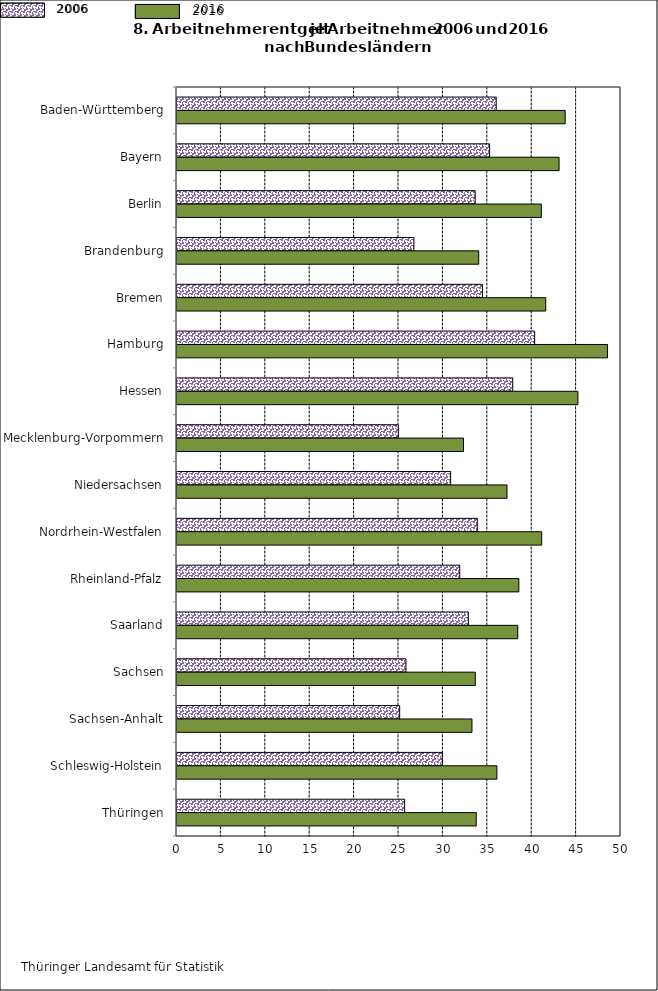
| Category | Series 3 | Series 4 |
|---|---|---|
| Baden-Württemberg | 35.951 | 43.715 |
| Bayern | 35.201 | 43.026 |
| Berlin | 33.575 | 41.03 |
| Brandenburg | 26.68 | 33.98 |
| Bremen | 34.398 | 41.522 |
| Hamburg | 40.275 | 48.484 |
| Hessen | 37.811 | 45.146 |
| Mecklenburg-Vorpommern | 24.919 | 32.263 |
| Niedersachsen | 30.816 | 37.16 |
| Nordrhein-Westfalen | 33.815 | 41.067 |
| Rheinland-Pfalz | 31.839 | 38.496 |
| Saarland | 32.807 | 38.37 |
| Sachsen | 25.783 | 33.593 |
| Sachsen-Anhalt | 25.074 | 33.22 |
| Schleswig-Holstein | 29.882 | 36.025 |
| Thüringen | 25.635 | 33.7 |